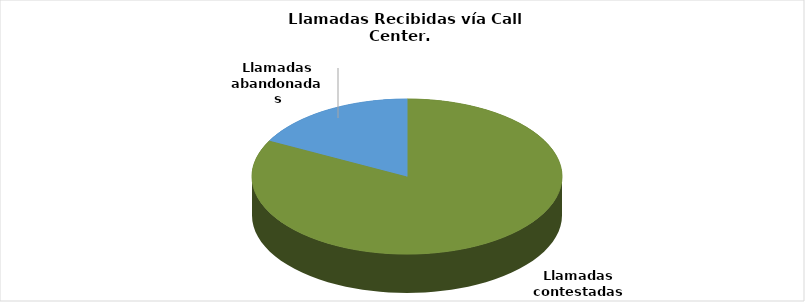
| Category | Enero-Septiembre |
|---|---|
| Llamadas contestadas | 169527 |
| Llamadas abandonadas | 35582 |